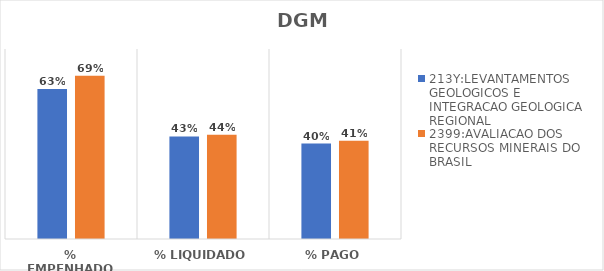
| Category | 213Y:LEVANTAMENTOS GEOLOGICOS E INTEGRACAO GEOLOGICA REGIONAL | 2399:AVALIACAO DOS RECURSOS MINERAIS DO BRASIL |
|---|---|---|
| % EMPENHADO | 0.631 | 0.688 |
| % LIQUIDADO | 0.432 | 0.439 |
| % PAGO | 0.402 | 0.414 |